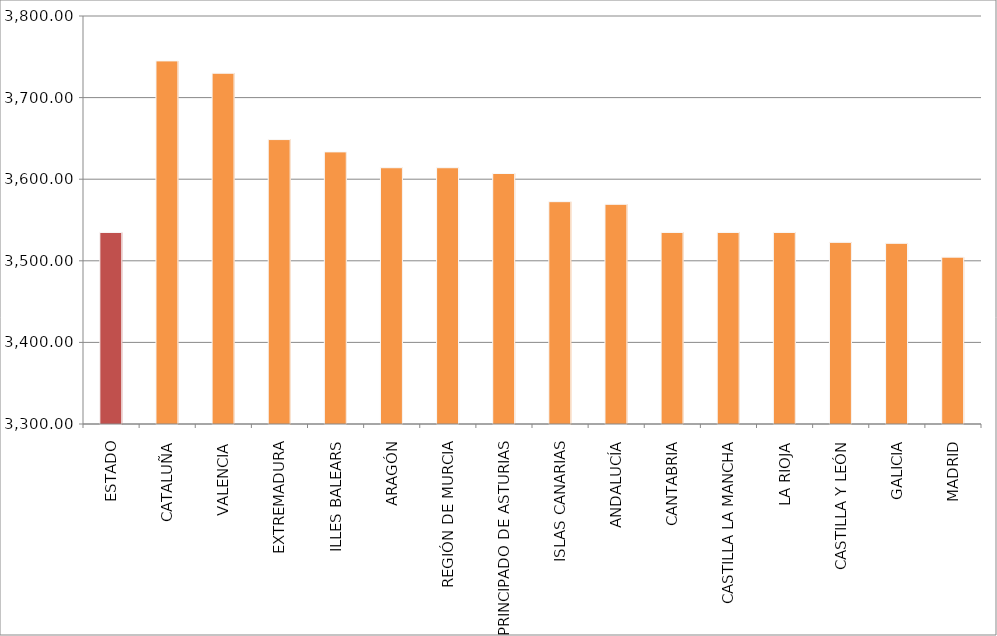
| Category | Series 0 |
|---|---|
| ESTADO | 3534.75 |
| CATALUÑA | 3744.977 |
| VALENCIA | 3729.863 |
| EXTREMADURA | 3648.562 |
| ILLES BALEARS | 3633.469 |
| ARAGÓN | 3614.062 |
| REGIÓN DE MURCIA | 3614.062 |
| PRINCIPADO DE ASTURIAS | 3606.977 |
| ISLAS CANARIAS | 3572.476 |
| ANDALUCÍA | 3569.25 |
| CANTABRIA | 3534.75 |
| CASTILLA LA MANCHA | 3534.75 |
| LA RIOJA | 3534.75 |
| CASTILLA Y LEÓN | 3522.625 |
| GALICIA | 3521.442 |
| MADRID | 3504.49 |